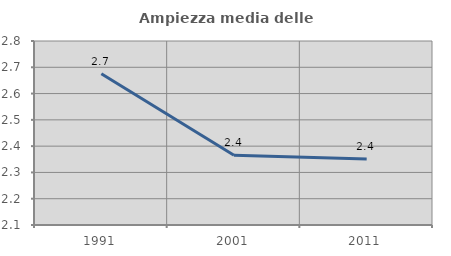
| Category | Ampiezza media delle famiglie |
|---|---|
| 1991.0 | 2.675 |
| 2001.0 | 2.365 |
| 2011.0 | 2.351 |